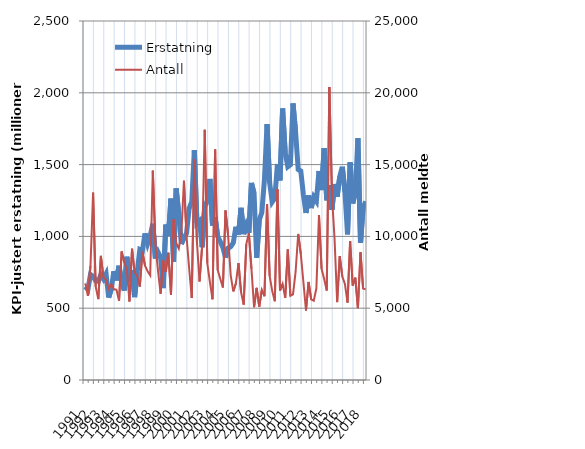
| Category | Erstatning |
|---|---|
| 1991.0 | 650.648 |
| nan | 629.43 |
| nan | 734.421 |
| nan | 721.938 |
| 1992.0 | 690.768 |
| nan | 686.357 |
| nan | 732.841 |
| nan | 703.455 |
| 1993.0 | 738.657 |
| nan | 573.657 |
| nan | 632.921 |
| nan | 757.464 |
| 1994.0 | 693.558 |
| nan | 795.624 |
| nan | 681.909 |
| nan | 622.598 |
| 1995.0 | 858.103 |
| nan | 725.295 |
| nan | 765.293 |
| nan | 577.138 |
| 1996.0 | 751.945 |
| nan | 908.415 |
| nan | 899.355 |
| nan | 1020.479 |
| 1997.0 | 949.161 |
| nan | 1003.74 |
| nan | 1088.191 |
| nan | 846 |
| 1998.0 | 891.248 |
| nan | 854.067 |
| nan | 640.093 |
| nan | 1082.595 |
| 1999.0 | 1003.069 |
| nan | 1263.121 |
| nan | 822.903 |
| nan | 1334.104 |
| 2000.0 | 1156.953 |
| nan | 946.831 |
| nan | 989.887 |
| nan | 1021.591 |
| 2001.0 | 1194.144 |
| nan | 1243.018 |
| nan | 1600.525 |
| nan | 1090.774 |
| 2002.0 | 1107.878 |
| nan | 924.647 |
| nan | 1206.522 |
| nan | 1247.951 |
| 2003.0 | 1400.268 |
| nan | 1074.864 |
| nan | 1134.634 |
| nan | 999.249 |
| 2004.0 | 963.726 |
| nan | 921.914 |
| nan | 852.553 |
| nan | 918.486 |
| 2005.0 | 928.439 |
| nan | 955.172 |
| nan | 1067.054 |
| nan | 1012.587 |
| 2006.0 | 1199.028 |
| nan | 1015.548 |
| nan | 1076.989 |
| nan | 1024.518 |
| 2007.0 | 1371.989 |
| nan | 1299.703 |
| nan | 851.519 |
| nan | 1113.965 |
| 2008.0 | 1166.754 |
| nan | 1395.909 |
| nan | 1782.351 |
| nan | 1373.023 |
| 2009.0 | 1239.722 |
| nan | 1265.696 |
| nan | 1504.367 |
| nan | 1389.958 |
| 2010.0 | 1890.587 |
| nan | 1582.148 |
| nan | 1485.47 |
| nan | 1499.799 |
| 2011.0 | 1925.715 |
| nan | 1727.709 |
| nan | 1466.19 |
| nan | 1455.486 |
| 2012.0 | 1289.19 |
| nan | 1163.089 |
| nan | 1285.325 |
| nan | 1197.586 |
| 2013.0 | 1274.225 |
| nan | 1245.98 |
| nan | 1455.531 |
| nan | 1322.905 |
| 2014.0 | 1613.943 |
| nan | 1251.164 |
| nan | 1357.353 |
| nan | 1184.708 |
| 2015.0 | 1364.912 |
| nan | 1275.895 |
| nan | 1416.944 |
| nan | 1484.685 |
| 2016.0 | 1310.689 |
| nan | 1014.193 |
| nan | 1516.078 |
| nan | 1229.613 |
| 2017.0 | 1307.073 |
| nan | 1684.101 |
| nan | 955.943 |
| nan | 1198.321 |
| 2018.0 | 1244.297 |